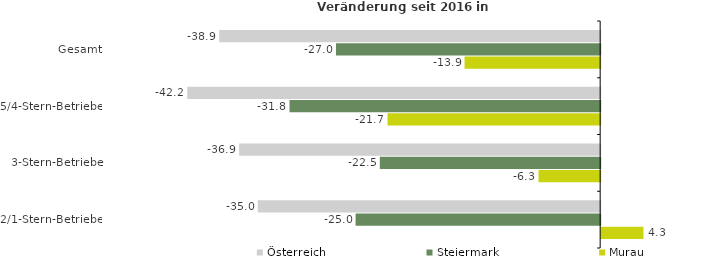
| Category | Österreich | Steiermark | Murau |
|---|---|---|---|
| Gesamt | -38.943 | -27.005 | -13.865 |
| 5/4-Stern-Betriebe | -42.206 | -31.755 | -21.738 |
| 3-Stern-Betriebe | -36.907 | -22.524 | -6.304 |
| 2/1-Stern-Betriebe | -34.996 | -25 | 4.322 |